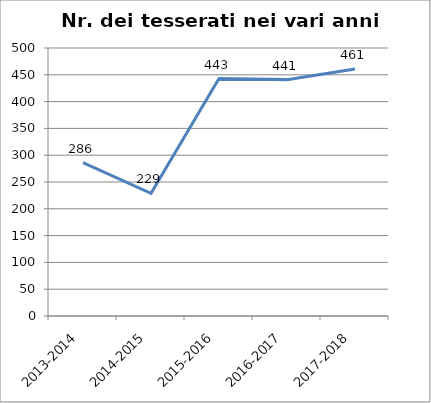
| Category | Nr. Tesserati |
|---|---|
| 2013-2014 | 286 |
| 2014-2015 | 229 |
| 2015-2016 | 443 |
| 2016-2017 | 441 |
| 2017-2018 | 461 |